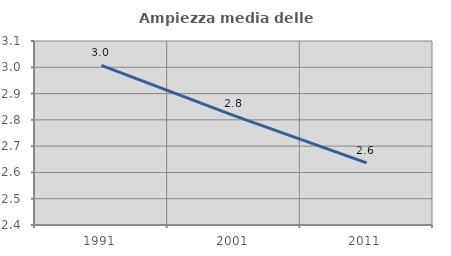
| Category | Ampiezza media delle famiglie |
|---|---|
| 1991.0 | 3.007 |
| 2001.0 | 2.816 |
| 2011.0 | 2.636 |